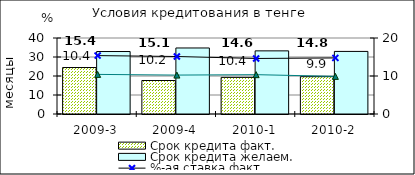
| Category | Срок кредита факт.  | Срок кредита желаем. |
|---|---|---|
| 2009-3 | 24.46 | 32.88 |
| 2009-4 | 17.63 | 34.75 |
| 2010-1 | 19.26 | 33.23 |
| 2010-2 | 19.64 | 32.94 |